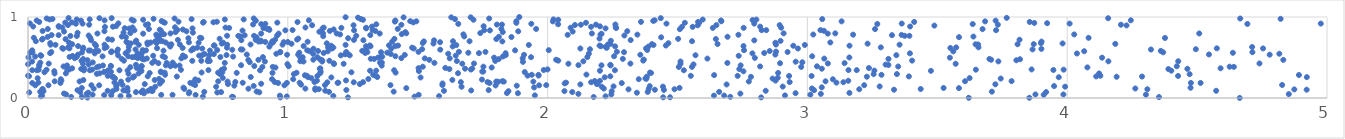
| Category | Series 0 |
|---|---|
| 3.6572658706064907 | 0.661 |
| 0.12488495006615727 | 0.186 |
| 5.305837688356848 | 0.75 |
| 4.641559317496017 | 0.384 |
| 0.016328903173061366 | 0.185 |
| 1.1230672763371188 | 0.362 |
| 2.6889829667601166 | 0.167 |
| 1.136332484358513 | 0.763 |
| 3.7351509413881963 | 0.452 |
| 0.7432439911413219 | 0.073 |
| 3.0502850701890116 | 0.838 |
| 5.891432376077439 | 0.377 |
| 1.694871493785665 | 0.559 |
| 2.199783628751933 | 0.734 |
| 0.7177247595777002 | 0.649 |
| 0.4360049572688473 | 0.073 |
| 0.5077936578489315 | 0.178 |
| 4.575916442292629 | 0.613 |
| 0.9712841414920481 | 0.007 |
| 0.3824785432868489 | 0.124 |
| 2.2014640019795064 | 0.212 |
| 3.7245375799674973 | 0.955 |
| 1.9451837285423832 | 0.202 |
| 2.201658809109568 | 0.885 |
| 1.0676309917624813 | 0.116 |
| 2.170408864286476 | 0.797 |
| 1.9948663302840532 | 0.159 |
| 0.8191619935575553 | 0.6 |
| 2.87731302166413 | 0.215 |
| 0.6693710988600182 | 0.527 |
| 0.13528188857759899 | 0.607 |
| 1.5195376897890995 | 0.386 |
| 0.34780277661037123 | 0.921 |
| 0.3022666151894579 | 0.628 |
| 4.037467137257961 | 0.55 |
| 0.1511107909865838 | 0.351 |
| 19.713826871288113 | 0.802 |
| 2.1187211437940414 | 0.405 |
| 3.199599758190691 | 0.108 |
| 0.6556808207226618 | 0.217 |
| 0.08563399323390293 | 0.678 |
| 5.979083235172496 | 0.867 |
| 2.394298118082215 | 0.314 |
| 0.04329534751722965 | 0.393 |
| 1.2040109968016028 | 0.527 |
| 1.843560081333627 | 0.061 |
| 2.2598612966648948 | 0.637 |
| 3.3954784804568994 | 0.883 |
| 0.21676148546968782 | 0.363 |
| 0.7681378466997406 | 0.203 |
| 0.897345921890046 | 0.699 |
| 6.013296331971207 | 0.216 |
| 1.1519363624004133 | 0.193 |
| 1.8493596561021688 | 0.085 |
| 0.27392614190585735 | 0.157 |
| 2.963587571943946 | 0.611 |
| 0.598414545187248 | 0.128 |
| 0.01709591938509628 | 0.562 |
| 0.04698012082321113 | 0.077 |
| 1.3193985932964274 | 0.484 |
| 0.934819934063425 | 0.667 |
| 1.544779772904844 | 0.471 |
| 4.816527514047724 | 0.546 |
| 1.7997471160500158 | 0.155 |
| 5.51819471532723 | 0.424 |
| 0.04116393437493838 | 0.349 |
| 1.132338345856245 | 0.451 |
| 1.0763205903068263 | 0.694 |
| 5.975241014381672 | 0.348 |
| 2.040529270171328 | 0.91 |
| 0.9973061045659336 | 0.534 |
| 0.008048993572136683 | 0.561 |
| 0.4404632410741771 | 0.481 |
| 2.866065341260575 | 0.24 |
| 0.2074330044115551 | 0.014 |
| 0.9290228920530227 | 0.634 |
| 0.4142781996018448 | 0.691 |
| 0.14337350675426855 | 0.931 |
| 3.647244868787 | 0.663 |
| 1.4560316584508104 | 0.799 |
| 2.1477250295039294 | 0.929 |
| 0.31985534916476954 | 0.566 |
| 0.0538037949354863 | 0.098 |
| 3.3445056514703095 | 0.296 |
| 0.996501891847038 | 0.186 |
| 1.0358331306130468 | 0.721 |
| 0.41157433685007827 | 0.507 |
| 2.6409552612627962 | 0.283 |
| 0.634714047385056 | 0.174 |
| 7.459160357036828 | 0.591 |
| 1.2447681225433125 | 0.317 |
| 0.29324555355153226 | 0.036 |
| 1.0572380195084625 | 0.504 |
| 0.003911363912921102 | 0.27 |
| 2.7379404052520386 | 0.357 |
| 0.6970017349472133 | 0.526 |
| 0.8710449589008822 | 0.395 |
| 3.855775914844659 | 0.939 |
| 0.16888162406346854 | 0.933 |
| 1.1441971103258843 | 0.09 |
| 3.726191859375836 | 0.837 |
| 0.1368109731713912 | 0.389 |
| 1.7751314844101873 | 0.981 |
| 0.03405276773113676 | 0.343 |
| 1.0142567008799828 | 0.67 |
| 2.1260314594049996 | 0.168 |
| 3.0370177167834367 | 0.391 |
| 0.5237092959568563 | 0.788 |
| 2.742001696406909 | 0.054 |
| 0.23841049227318112 | 0.343 |
| 0.25281846249545636 | 0.115 |
| 0.28699921544127677 | 0.514 |
| 3.5241903376812123 | 0.124 |
| 3.624321500921202 | 0.246 |
| 2.4649259835545556 | 0.677 |
| 1.9228929803768624 | 0.276 |
| 5.687120088991513 | 0.275 |
| 9.10378918165163 | 0.73 |
| 0.749723624523458 | 0.248 |
| 0.9798089048122839 | 0.659 |
| 5.96305607896453 | 0.243 |
| 2.2665881704226982 | 0.571 |
| 0.07996523489264055 | 0.425 |
| 2.2230138888239206 | 0.859 |
| 0.24407906333506052 | 0.158 |
| 1.2538980898227912 | 0.194 |
| 3.1620825113411635 | 0.646 |
| 0.07611435932792937 | 0.852 |
| 0.04323611643794419 | 0.409 |
| 1.704565283657152 | 0.351 |
| 5.3413033552539035 | 0.276 |
| 1.450273264688936 | 0.532 |
| 4.308544645458117 | 0.108 |
| 2.8947501795117825 | 0.429 |
| 2.8967109116318954 | 0.705 |
| 1.7059051133903989 | 0.093 |
| 1.3100868431726298 | 0.235 |
| 2.158747964611163 | 0.547 |
| 1.9390213935937741 | 0.286 |
| 2.318728156968597 | 0.425 |
| 2.3854356107078316 | 0.075 |
| 0.1446168229536243 | 0.727 |
| 0.20489666832608042 | 0.359 |
| 3.1572925125925044 | 0.213 |
| 0.326412456923385 | 0.085 |
| 1.9362093375599272 | 0.503 |
| 0.41642204547915457 | 0.709 |
| 1.1246083667831481 | 0.476 |
| 1.7984190879025688 | 0.458 |
| 0.18791080333996288 | 0.765 |
| 3.390539360444874 | 0.267 |
| 1.985237484173842 | 0.346 |
| 1.1164574343756883 | 0.581 |
| 0.24008588331761033 | 0.586 |
| 0.015880020758756677 | 0.45 |
| 0.10227470504329522 | 0.303 |
| 4.590344274909963 | 0.367 |
| 1.3371665001823427 | 0.827 |
| 0.48962874651928023 | 0.138 |
| 2.0771940453352773 | 0.779 |
| 2.20741523518876 | 0.404 |
| 0.46089144817092875 | 0.269 |
| 2.3113832788262823 | 0.107 |
| 0.2115862414245469 | 0.608 |
| 3.7859165728816095 | 0.208 |
| 2.2413051002884226 | 0.268 |
| 1.6360491299404136 | 0.701 |
| 1.318408826099716 | 0.638 |
| 0.5109315562778457 | 0.325 |
| 1.6716150434163148 | 0.424 |
| 1.8257715845013909 | 0.698 |
| 0.5123360225991334 | 0.318 |
| 1.1698581278180928 | 0.611 |
| 0.37838222935268817 | 0.092 |
| 1.2061366924332129 | 0.866 |
| 2.2197884060904762 | 0.256 |
| 3.583340335821098 | 0.122 |
| 4.874221900602746 | 0.106 |
| 0.5484531121508318 | 0.797 |
| 0.7478820321444526 | 0.316 |
| 1.0002951579853085 | 0.691 |
| 2.2637852078258858 | 0.863 |
| 7.484753117693394 | 0.475 |
| 4.24485629311146 | 0.959 |
| 1.1540451129421998 | 0.577 |
| 1.3007781258458542 | 0.639 |
| 1.8383366832489172 | 0.553 |
| 1.4093306193410033 | 0.343 |
| 8.834869042249903 | 0.205 |
| 1.8023230566815398 | 0.203 |
| 1.6552042546350665 | 0.306 |
| 0.6994692365747046 | 0.456 |
| 1.699564696704696 | 0.701 |
| 0.2593628345680839 | 0.58 |
| 1.6586903435621068 | 0.57 |
| 2.1892897500965782 | 0.175 |
| 3.016168182065957 | 0.271 |
| 2.0648662801384834 | 0.085 |
| 1.2247130168417522 | 0.568 |
| 1.9653390136020064 | 0.277 |
| 0.16619963546744254 | 0.013 |
| 0.941028120334346 | 0.31 |
| 0.5887272784408832 | 0.348 |
| 1.7777789901737795 | 0.835 |
| 2.4065918340592996 | 0.952 |
| 4.712905403056651 | 0.565 |
| 2.7030642187105136 | 0.014 |
| 0.4022885292404415 | 0.871 |
| 3.621010425874077 | 0.003 |
| 1.0234992284618079 | 0.295 |
| 2.517089263345871 | 0.878 |
| 3.4887514881380004 | 0.894 |
| 7.38437663269143 | 0.954 |
| 2.177368376322049 | 0.012 |
| 0.15754547015857084 | 0.685 |
| 2.382258633060556 | 0.264 |
| 5.111035273042533 | 0.186 |
| 3.057132698206381 | 0.974 |
| 2.7882913034767367 | 0.551 |
| 2.471505294997942 | 0.009 |
| 1.4231544294976664 | 0.853 |
| 0.5832647752675778 | 0.4 |
| 1.6435756813526847 | 0.974 |
| 0.8776763827473373 | 0.738 |
| 1.3175530496773338 | 0.777 |
| 0.053862407323460475 | 0.721 |
| 1.3015326760039185 | 0.867 |
| 1.1882272284687423 | 0.796 |
| 5.407444704901816 | 0.435 |
| 8.36790380814906 | 0.866 |
| 3.55028630973469 | 0.618 |
| 0.0004735695306663168 | 0.275 |
| 0.4796169601096651 | 0.089 |
| 2.3979806533466026 | 0.309 |
| 2.8181735464074067 | 0.881 |
| 1.8608869940167534 | 0.753 |
| 0.08687996721296803 | 0.658 |
| 0.6944467894887103 | 0.479 |
| 1.5867787742963628 | 0.597 |
| 0.15954333496815 | 0.613 |
| 4.122841754037557 | 0.303 |
| 4.831832467227187 | 0.471 |
| 0.8535575141876922 | 0.442 |
| 0.4605202783097196 | 0.662 |
| 0.3405197279610687 | 0.112 |
| 1.656173618586531 | 0.915 |
| 0.3867685587077209 | 0.299 |
| 0.9694873911283568 | 0.029 |
| 2.356915241524508 | 0.534 |
| 0.7852443190133125 | 0.014 |
| 0.5962538665534964 | 0.845 |
| 3.2825458390050652 | 0.625 |
| 0.18770555300201347 | 0.508 |
| 2.2538251864035828 | 0.143 |
| 0.51190923874959 | 0.829 |
| 0.118498932582102 | 0.879 |
| 0.17182000761298416 | 0.519 |
| 1.8857919528792364 | 0.059 |
| 0.20091316630416411 | 0.072 |
| 1.1121336471706837 | 0.214 |
| 0.2757360710344821 | 0.304 |
| 1.2148642324067536 | 0.422 |
| 1.3443734019371725 | 0.259 |
| 3.898923914208882 | 0.677 |
| 0.6672609124131331 | 0.739 |
| 5.956493366089798 | 0.335 |
| 4.693451552981267 | 0.914 |
| 0.05081281222401013 | 0.521 |
| 1.1943550193319816 | 0.189 |
| 0.6017575632879553 | 0.112 |
| 2.635929592020172 | 0.865 |
| 2.5616420845588657 | 0.414 |
| 1.3549117083108686 | 0.436 |
| 3.986235770537355 | 0.35 |
| 0.2060314472379652 | 0.458 |
| 10.31824751857852 | 0.852 |
| 1.7098841289265538 | 0.364 |
| 0.49369308793589406 | 0.781 |
| 5.669549067581493 | 0.986 |
| 4.426776216230428 | 0.272 |
| 0.6209823151953527 | 0.071 |
| 1.752348451570769 | 0.327 |
| 0.2071432009293176 | 0.124 |
| 0.30874417885118616 | 0.725 |
| 9.092827902446187 | 0.908 |
| 1.3153903593284209 | 0.649 |
| 2.5557748340125235 | 0.384 |
| 1.098908765739014 | 0.609 |
| 0.4494804308173819 | 0.172 |
| 1.9373488450836887 | 0.916 |
| 1.6293222107819736 | 0.996 |
| 0.8801060534009901 | 0.748 |
| 2.4355026057825944 | 0.986 |
| 0.398955751160589 | 0.967 |
| 1.560609557395247 | 0.673 |
| 0.9628184683578631 | 0.185 |
| 2.8858221507320154 | 0.249 |
| 0.7666822486174345 | 0.657 |
| 2.3930410547894607 | 0.147 |
| 0.5198514401351664 | 0.939 |
| 4.5457908324637355 | 0.538 |
| 0.4432627613463488 | 0.966 |
| 0.08969663377651806 | 0.568 |
| 0.8480944456128245 | 0.469 |
| 0.05967912167219596 | 0.084 |
| 0.3072535856171781 | 0.34 |
| 1.0781896072318118 | 0.257 |
| 0.5271361640963339 | 0.503 |
| 0.39550619100631895 | 0.674 |
| 0.713657947650901 | 0.935 |
| 0.45951787873604344 | 0.684 |
| 0.6729042743764846 | 0.016 |
| 2.25908993591751 | 0.343 |
| 0.7661805715309865 | 0.768 |
| 0.6436693619621839 | 0.229 |
| 0.8168733600097449 | 0.76 |
| 0.1545145019196297 | 0.624 |
| 3.1759546082929626 | 0.782 |
| 0.5476992090965954 | 0.635 |
| 2.2895825603855746 | 0.483 |
| 0.21495822280392662 | 0.34 |
| 2.5091191616605535 | 0.85 |
| 2.6403866438740797 | 0.029 |
| 2.8338152752529577 | 0.555 |
| 2.0656644738968577 | 0.18 |
| 3.5727598205951043 | 0.624 |
| 3.985419098167845 | 0.044 |
| 0.1874893764436643 | 0.97 |
| 2.8549696111737304 | 0.58 |
| 5.582486102609008 | 0.821 |
| 3.055652911545339 | 0.362 |
| 2.887281529583459 | 0.309 |
| 0.4624625532021408 | 0.089 |
| 3.161491187434072 | 0.5 |
| 4.740142416947577 | 0.426 |
| 3.257749285732577 | 0.338 |
| 1.5950690547963449 | 0.159 |
| 0.7980263941058955 | 0.198 |
| 0.6324591302473828 | 0.458 |
| 0.08516762065564383 | 0.554 |
| 1.4244992051141685 | 0.647 |
| 0.2650923158131358 | 0.379 |
| 4.821419174379522 | 0.978 |
| 0.3896381135009718 | 0.858 |
| 2.0202081495225075 | 0.946 |
| 4.3533563455344835 | 0.011 |
| 2.443988721316575 | 0.14 |
| 1.828251476174368 | 0.513 |
| 4.5733436881384195 | 0.089 |
| 0.09091087823421723 | 0.777 |
| 3.3009994922308215 | 0.413 |
| 2.447691817516153 | 0.1 |
| 0.016196257893473863 | 0.588 |
| 3.47541891699439 | 0.335 |
| 1.060511468171022 | 0.451 |
| 1.2634051559532422 | 0.768 |
| 0.6347670892564682 | 0.807 |
| 2.227714575237633 | 0.62 |
| 2.692565900424227 | 0.756 |
| 2.407712318024307 | 0.655 |
| 4.322457837269195 | 0.599 |
| 0.20401637724634883 | 0.955 |
| 0.4068750280784092 | 0.955 |
| 4.082305115696589 | 0.743 |
| 2.167693068298063 | 0.195 |
| 2.4552618379375346 | 0.648 |
| 4.637710018494741 | 0.558 |
| 0.19852478520637404 | 0.204 |
| 1.8869838525477636 | 0.823 |
| 3.2690730073949448 | 0.914 |
| 0.913506587524087 | 0.692 |
| 1.5170675516697318 | 0.603 |
| 1.7940597288174625 | 0.498 |
| 0.3520448860973335 | 0.342 |
| 6.71605705372137 | 0.654 |
| 2.457508111277598 | 0.918 |
| 2.7356050836539985 | 0.521 |
| 3.1073192767398266 | 0.798 |
| 2.1184700533398515 | 0.051 |
| 0.4946670490232352 | 0.678 |
| 2.0710813709217937 | 0.19 |
| 1.093599786150519 | 0.899 |
| 0.5845518973296717 | 0.66 |
| 1.909362751198064 | 0.533 |
| 2.7977058141576907 | 0.495 |
| 1.3025203214545427 | 0.605 |
| 4.976156562541755 | 0.919 |
| 2.6676092687974826 | 0.957 |
| 1.9050729021284787 | 0.446 |
| 0.34252750024188927 | 0.571 |
| 0.9062628775882867 | 0.863 |
| 1.7485522822169797 | 0.327 |
| 0.2131419213201437 | 0.221 |
| 4.127630382687632 | 0.275 |
| 0.15623986059543252 | 0.987 |
| 5.14926126685312 | 0.37 |
| 0.2331260336843538 | 0.413 |
| 3.011355169124624 | 0.041 |
| 6.904757796338855 | 0.905 |
| 0.10578354478773558 | 0.656 |
| 0.5770055135149057 | 0.717 |
| 2.18619768911902 | 0.905 |
| 0.4011008315008461 | 0.504 |
| 7.189522104679802 | 0.219 |
| 3.411031277150165 | 0.939 |
| 1.6759404929458854 | 0.786 |
| 1.595635366578127 | 0.18 |
| 2.3881734020301297 | 0.635 |
| 2.2050185330405245 | 0.639 |
| 2.9899849423137814 | 0.655 |
| 2.3066192448412655 | 0.825 |
| 1.1057032084484166 | 0.119 |
| 0.23352246316437245 | 0.771 |
| 0.8874772131061719 | 0.697 |
| 0.14691706105682603 | 0.045 |
| 0.8701436826259812 | 0.767 |
| 2.0886264498170166 | 0.868 |
| 7.708364549669626 | 0.298 |
| 3.051763917971592 | 0.051 |
| 2.5115748157142774 | 0.422 |
| 5.163846975870921 | 0.162 |
| 5.375932499903694 | 0.582 |
| 0.05695962641754336 | 0.731 |
| 0.36062882814133657 | 0.483 |
| 3.285123140266262 | 0.286 |
| 3.6389821688630644 | 0.759 |
| 8.40320109770549 | 0.806 |
| 0.09426934754585325 | 0.976 |
| 8.585694580883034 | 0.61 |
| 0.3768496423713827 | 0.751 |
| 2.5051517141083943 | 0.383 |
| 0.7321621842734815 | 0.206 |
| 8.799191146673632 | 0.168 |
| 5.751660565809943 | 0.792 |
| 2.2854487300785484 | 0.184 |
| 1.0678589538555623 | 0.87 |
| 3.9468749235398772 | 0.346 |
| 3.922769523622227 | 0.924 |
| 1.2980366523473665 | 0.556 |
| 1.7039802680595872 | 0.996 |
| 3.392600869856881 | 0.768 |
| 0.8302249388067582 | 0.97 |
| 2.615057849228092 | 0.486 |
| 0.34681359968811404 | 0.527 |
| 5.76627291410505 | 0.222 |
| 0.8974329683252511 | 0.176 |
| 0.21003840847387995 | 0.918 |
| 0.6043043966057309 | 0.509 |
| 1.1354313111598557 | 0.799 |
| 0.1699347566725617 | 0.367 |
| 1.622122449372031 | 0.357 |
| 2.77448406824726 | 0.204 |
| 2.1376976341401703 | 0.453 |
| 1.3016193995359697 | 0.86 |
| 2.9050141427959533 | 0.141 |
| 1.1055312595423805 | 0.102 |
| 1.6505905255360354 | 0.456 |
| 1.1550209112158383 | 0.626 |
| 0.7270907592951766 | 0.941 |
| 0.36919593641016973 | 0.46 |
| 0.8903523567206577 | 0.07 |
| 1.6792123900804246 | 0.76 |
| 2.8767137726068097 | 0.681 |
| 0.2290059505381542 | 0.467 |
| 0.07135446646143953 | 0.349 |
| 2.2420842169418025 | 0.668 |
| 4.077701065580592 | 0.378 |
| 0.438851497320443 | 0.557 |
| 4.753893673025617 | 0.612 |
| 3.0175384865231023 | 0.118 |
| 2.5583956048424503 | 0.878 |
| 0.6764778460676041 | 0.938 |
| 1.3262060433461216 | 0.838 |
| 0.32447688942664893 | 0.262 |
| 3.0697140755250145 | 0.206 |
| 6.177295548623936 | 0.956 |
| 2.597043801973548 | 0.968 |
| 1.7847877079189591 | 0.377 |
| 1.2384181158006928 | 0.527 |
| 5.207874169686829 | 0.773 |
| 5.097012474339593 | 0.993 |
| 0.48769499269717415 | 0.222 |
| 0.6368216768582246 | 0.603 |
| 2.3508539793193273 | 0.232 |
| 5.18884567245709 | 0.663 |
| 1.64854942958686 | 0.653 |
| 2.8415877768167497 | 0.838 |
| 0.16318641419585497 | 0.766 |
| 0.5018784410948749 | 0.43 |
| 4.922347808477579 | 0.258 |
| 2.7561124593420123 | 0.591 |
| 0.8095703244667993 | 0.766 |
| 2.5826163548461016 | 0.926 |
| 0.23360991914202958 | 0.586 |
| 2.262131421697066 | 0.874 |
| 1.3324558370131618 | 0.482 |
| 6.421418506341996 | 0.792 |
| 0.3458250551518705 | 0.599 |
| 0.6410023526970536 | 0.202 |
| 0.5070655456751068 | 0.844 |
| 0.38630076480016673 | 0.585 |
| 3.2186259323821695 | 0.158 |
| 3.7331648717914674 | 0.905 |
| 0.6708352216978104 | 0.61 |
| 1.2253490750084894 | 0.099 |
| 1.9508988264193845 | 0.032 |
| 0.8265547228214193 | 0.188 |
| 1.511064573477946 | 0.253 |
| 1.6822700699939843 | 0.362 |
| 0.319111393921192 | 0.398 |
| 2.913786361221685 | 0.032 |
| 2.0043783222079297 | 0.591 |
| 1.4521718042186553 | 0.813 |
| 1.9558027467562231 | 0.852 |
| 0.24923347394853199 | 0.439 |
| 1.6462454896110585 | 0.523 |
| 3.278072590309628 | 0.143 |
| 0.1909099586631372 | 0.805 |
| 2.3703488150875875 | 0.474 |
| 0.40972761682487796 | 0.836 |
| 2.5282329269208077 | 0.929 |
| 0.42273421250584675 | 0.492 |
| 0.6619364947550141 | 0.743 |
| 1.3961503631235321 | 0.544 |
| 2.437101100580808 | 0.749 |
| 2.343692598610321 | 0.065 |
| 0.6285249557696834 | 0.588 |
| 1.5046522402798246 | 0.333 |
| 0.38795264401666985 | 0.631 |
| 0.13865192373612328 | 0.055 |
| 0.3676828332315766 | 0.808 |
| 5.148465887441961 | 0.201 |
| 1.668759888127328 | 0.139 |
| 1.0908737138661475 | 0.245 |
| 1.407538378316451 | 0.079 |
| 1.4561083187374606 | 0.122 |
| 2.89898680550804 | 0.868 |
| 0.7895420727452027 | 0.511 |
| 0.3193362267371726 | 0.323 |
| 4.111690865215847 | 0.267 |
| 0.7641856874414632 | 0.53 |
| 2.241397577051325 | 0.409 |
| 3.7071553927482177 | 0.472 |
| 0.6670977362628746 | 0.459 |
| 6.939087758979724 | 0.571 |
| 2.95496314814982 | 0.448 |
| 0.3234168345926125 | 0.72 |
| 3.866700362573191 | 0.6 |
| 3.1118447115454693 | 0.19 |
| 3.2288945935749522 | 0.263 |
| 0.9291854632269494 | 0.841 |
| 5.209456396152935 | 0.716 |
| 3.3494277224041658 | 0.389 |
| 0.4832378161485963 | 0.978 |
| 0.43666101825655035 | 0.333 |
| 1.3952370556762421 | 0.159 |
| 0.04321757868297564 | 0.939 |
| 1.5032679952290395 | 0.369 |
| 0.3065488567497712 | 0.089 |
| 1.1326506241106653 | 0.465 |
| 2.822132100577999 | 0.008 |
| 6.40757166788218 | 0.231 |
| 1.2893471367503768 | 0.965 |
| 0.3561583824230933 | 0.023 |
| 4.625213523371893 | 0.386 |
| 6.147948978953677 | 0.294 |
| 0.8572639132625396 | 0.259 |
| 1.740909549940414 | 0.801 |
| 2.105349454650429 | 0.901 |
| 1.231588896123453 | 0.008 |
| 2.412916418041942 | 0.102 |
| 0.5961023093736197 | 0.525 |
| 0.0002992944555704064 | 0.417 |
| 1.1777675037072575 | 0.42 |
| 1.2773494710291313 | 0.172 |
| 2.319724219320752 | 0.715 |
| 0.7941621136650354 | 0.153 |
| 0.07877688157625426 | 0.157 |
| 0.23555242144945793 | 0.905 |
| 0.489647814200831 | 0.7 |
| 3.0635766962271926 | 0.83 |
| 0.9984994209821714 | 0.418 |
| 5.524609342988502 | 0.183 |
| 2.2955458895775336 | 0.771 |
| 3.333408147958844 | 0.102 |
| 1.0441492613775287 | 0.56 |
| 3.7100634002064186 | 0.079 |
| 1.2223970859439497 | 0.656 |
| 2.5692027269238014 | 0.528 |
| 1.3406602696478922 | 0.91 |
| 1.4948898736591276 | 0.947 |
| 3.4360631322730653 | 0.111 |
| 4.50825053574809 | 0.797 |
| 0.5127762260774804 | 0.039 |
| 3.2549196435305374 | 0.294 |
| 5.2090110584262845 | 0.977 |
| 3.909585646529983 | 0.04 |
| 2.245311301112599 | 0.044 |
| 0.07577064914420184 | 0.754 |
| 3.900739383370301 | 0.606 |
| 2.654116544883827 | 0.666 |
| 1.1916782551728433 | 0.187 |
| 1.1431319353098772 | 0.16 |
| 1.3895878474852021 | 0.65 |
| 5.570645281952213 | 0.227 |
| 0.10275325112081848 | 0.206 |
| 5.366230230882079 | 0.838 |
| 0.6191073646406455 | 0.058 |
| 5.9019928048932675 | 0.516 |
| 4.389426973169759 | 0.357 |
| 0.5751274690554433 | 0.84 |
| 1.3620243469484665 | 0.437 |
| 8.882228547905914 | 0.398 |
| 0.7603431505417247 | 0.87 |
| 0.803387964257158 | 0.31 |
| 0.7576480260551832 | 0.969 |
| 3.862932431655758 | 0.353 |
| 3.325617718402951 | 0.776 |
| 5.693279011420388 | 0.322 |
| 0.2672531185185897 | 0.796 |
| 2.9317442163613836 | 0.197 |
| 0.48186230696080684 | 0.521 |
| 2.818045503939663 | 0.389 |
| 3.5707127267204326 | 0.423 |
| 2.577952982444209 | 0.898 |
| 0.6784931092833711 | 0.076 |
| 1.2864931552264687 | 0.582 |
| 1.0478884397198673 | 0.501 |
| 0.7547992249400158 | 0.362 |
| 1.4140699559190766 | 0.957 |
| 2.6476087636657915 | 0.728 |
| 0.2399067561137815 | 0.742 |
| 1.7537472621681376 | 0.886 |
| 6.0863071187298265 | 0.073 |
| 1.4103069491053843 | 0.73 |
| 1.6011668629476354 | 0.088 |
| 1.1025737035712524 | 0.198 |
| 1.0033104246128703 | 0.392 |
| 0.4360045693973046 | 0.513 |
| 0.2651111383173145 | 0.298 |
| 1.6333956810738635 | 0.223 |
| 0.7241418357772829 | 0.139 |
| 1.6660668778429912 | 0.196 |
| 0.7891373598616785 | 0.013 |
| 1.6232319289567971 | 0.489 |
| 0.1923602820956957 | 0.535 |
| 4.664129966135105 | 0.001 |
| 0.5300786023027949 | 0.685 |
| 0.9394656428578849 | 0.232 |
| 2.0226529487458302 | 0.97 |
| 0.30713213842075443 | 0.274 |
| 4.228362454168687 | 0.896 |
| 0.10127094264088642 | 0.331 |
| 0.4216839281770647 | 0.55 |
| 2.153064877860706 | 0.506 |
| 1.316602023112295 | 0.337 |
| 3.0257026296878666 | 0.096 |
| 1.039957795088255 | 0.535 |
| 1.2811458246100291 | 0.975 |
| 8.18277813839318 | 0.304 |
| 0.13880981873121864 | 0.82 |
| 1.4140623633677833 | 0.516 |
| 2.8395120211189235 | 0.089 |
| 2.201449951480001 | 0.336 |
| 5.40365147144233 | 0.829 |
| 1.176541412293141 | 0.847 |
| 2.3892941483274805 | 0.113 |
| 0.6567141276857463 | 0.682 |
| 2.232330154727553 | 0.661 |
| 2.203259993338007 | 0.782 |
| 8.451662525216149 | 0.68 |
| 1.9647606437552754 | 0.286 |
| 0.6922658554610246 | 0.455 |
| 0.879981826853992 | 0.08 |
| 0.4540184034292582 | 0.588 |
| 1.6174846065539308 | 0.546 |
| 0.5216345346619454 | 0.585 |
| 3.018366840133118 | 0.515 |
| 4.369423084115776 | 0.564 |
| 1.5643483177791597 | 0.433 |
| 0.24863862778444143 | 0.041 |
| 0.526055764289805 | 0.314 |
| 0.049839532445898935 | 0.021 |
| 1.8118557066425838 | 0.48 |
| 6.207834453778395 | 0.198 |
| 1.4150036121980762 | 0.314 |
| 1.5237930968405526 | 0.699 |
| 0.36386905160772015 | 0.163 |
| 0.8976690346603061 | 0.912 |
| 0.7282803914717103 | 0.592 |
| 6.299998095520148 | 0.725 |
| 4.302946241629192 | 0.04 |
| 0.44633345483224957 | 0.058 |
| 0.5144097180030783 | 0.95 |
| 3.804309366349744 | 0.466 |
| 1.4784073509847226 | 0.622 |
| 2.75463225391715 | 0.866 |
| 4.471237304813311 | 0.294 |
| 2.5077780574872115 | 0.125 |
| 2.094812231190623 | 0.074 |
| 0.9422339572724338 | 0.384 |
| 3.6584271102612806 | 0.625 |
| 2.126076086565002 | 0.611 |
| 0.46841115842517744 | 0.309 |
| 1.3574442238240017 | 0.507 |
| 0.2942682367323346 | 0.824 |
| 0.8689082789076424 | 0.982 |
| 1.8313617383624914 | 0.202 |
| 0.2112235979346933 | 0.424 |
| 1.4711139469929584 | 0.948 |
| 0.5341627530294003 | 0.433 |
| 0.40892825560584173 | 0.267 |
| 5.6604062375039 | 0.788 |
| 1.175210051773415 | 0.024 |
| 2.2076524636878148 | 0.794 |
| 0.11814749899742286 | 0.887 |
| 2.876652300758741 | 0.536 |
| 1.3825546138791438 | 0.56 |
| 2.2558416276204727 | 0.516 |
| 2.7430687443532973 | 0.403 |
| 0.6451656921995791 | 0.038 |
| 0.0474251459877413 | 0.437 |
| 3.7671162401683476 | 0.989 |
| 4.853056090482726 | 0.048 |
| 2.3682639511022603 | 0.462 |
| 0.3580240805511828 | 0.202 |
| 0.28855944434357556 | 0.401 |
| 2.3801190290007237 | 0.237 |
| 1.752970944457016 | 0.387 |
| 0.6194026474462982 | 0.688 |
| 0.9117532438155257 | 0.45 |
| 4.665960555540251 | 0.981 |
| 0.5518848522944294 | 0.663 |
| 0.4431305579984002 | 0.794 |
| 0.6738151719996982 | 0.93 |
| 0.001925892435846932 | 0.501 |
| 1.1138453978742529 | 0.504 |
| 1.5272147207256117 | 0.489 |
| 3.3424002304425824 | 0.529 |
| 3.3626349780595044 | 0.779 |
| 1.1500168925008003 | 0.675 |
| 2.6919362438525596 | 0.433 |
| 0.8664090012962368 | 0.908 |
| 0.8421758026869075 | 0.536 |
| 0.3220540270916691 | 0.576 |
| 3.1384233397654127 | 0.195 |
| 4.779370672113402 | 0.535 |
| 0.5440195582509081 | 0.657 |
| 3.854421817114889 | 0.003 |
| 0.7286709331264797 | 0.068 |
| 1.8812896745648982 | 0.152 |
| 2.1494780297351914 | 0.289 |
| 1.0811183576572168 | 0.959 |
| 0.20760751159173074 | 0.562 |
| 1.0479515396757233 | 0.454 |
| 4.134204929871835 | 0.498 |
| 2.7344407761432423 | 0.78 |
| 0.4368089033651433 | 0.388 |
| 2.929495897102571 | 0.272 |
| 0.5665439820218947 | 0.399 |
| 0.8339886815688994 | 0.774 |
| 4.027013994746401 | 0.785 |
| 0.8763889347947463 | 0.718 |
| 1.8910610103036722 | 1 |
| 1.074688386736366 | 0.589 |
| 0.03709867018774776 | 0.244 |
| 1.0511650119005844 | 0.165 |
| 1.045567243833304 | 0.188 |
| 5.403915780425713 | 0.874 |
| 2.551236640606654 | 0.274 |
| 0.5677333889927638 | 0.813 |
| 1.8261854182446653 | 0.208 |
| 2.3455086520928403 | 0.782 |
| 2.444919853710864 | 0.009 |
| 8.228405156264326 | 0.68 |
| 5.438842716897398 | 0.948 |
| 1.6345500365355918 | 0.636 |
| 1.1383061262251484 | 0.869 |
| 5.666628536483314 | 0.909 |
| 1.2530229541602258 | 0.898 |
| 0.8211629588496531 | 0.714 |
| 2.2000014217653434 | 0.647 |
| 2.080078084885765 | 0.423 |
| 1.0657270732089505 | 0.281 |
| 0.4622881072246368 | 0.91 |
| 1.0207761703745106 | 0.232 |
| 3.991993187972897 | 0.14 |
| 0.4978166974793591 | 0.758 |
| 3.7005993874327103 | 0.482 |
| 5.989561991186676 | 0.573 |
| 0.4655157812855505 | 0.851 |
| 6.992114640042718 | 0.983 |
| 0.3188271062835567 | 0.391 |
| 2.2230030985515925 | 0.633 |
| 3.5484341137801714 | 0.498 |
| 2.893240854545802 | 0.9 |
| 0.21231041011829788 | 0.481 |
| 2.2163413177979137 | 0.117 |
| 10.189207472430308 | 0.601 |
| 4.5134486295674625 | 0.186 |
| 6.288969956160522 | 0.953 |
| 1.2545661760133502 | 0.717 |
| 5.6078156188534125 | 0.905 |
| 1.8098597817588584 | 0.2 |
| 1.0404445274123617 | 0.733 |
| 0.651671593140639 | 0.621 |
| 10.220288018707905 | 0.763 |
| 1.083300200459585 | 0.578 |
| 1.3401792562061097 | 0.337 |
| 0.33491956992112765 | 0.24 |
| 0.7573545852886978 | 0.433 |
| 0.8566685686445319 | 0.661 |
| 3.561509637182533 | 0.575 |
| 2.412244204252167 | 0.959 |
| 1.0982301115677975 | 0.473 |
| 1.2203427619238676 | 0.54 |
| 2.660209305467374 | 0.075 |
| 2.040743586886343 | 0.965 |
| 0.15393613802470382 | 0.901 |
| 1.7608085396148985 | 0.569 |
| 0.6248952242032368 | 0.187 |
| 8.153550776997815 | 0.481 |
| 0.063380087282769 | 0.318 |
| 0.22891054590797216 | 0.006 |
| 3.161827755717523 | 0.063 |
| 1.125215896178738 | 0.365 |
| 1.999960281660311 | 0.353 |
| 3.2317282871479267 | 0.671 |
| 0.1590014491358282 | 0.351 |
| 4.711835376791959 | 0.629 |
| 0.9022731568544158 | 0.383 |
| 0.054284862616984314 | 0.029 |
| 3.0786823450669374 | 0.427 |
| 2.795323378716216 | 0.919 |
| 2.128225020182307 | 0.905 |
| 0.8868573498181188 | 0.471 |
| 1.8242266770575015 | 0.906 |
| 2.0964479992293215 | 0.82 |
| 8.613133476044702 | 0.665 |
| 0.027612693685177957 | 0.511 |
| 0.8257255587773361 | 0.832 |
| 1.9277279420857536 | 0.655 |
| 0.2431399722839495 | 0.713 |
| 0.7742754708737406 | 0.864 |
| 2.5245254335669065 | 0.342 |
| 0.8255560141016134 | 0.598 |
| 0.37896140450228627 | 0.693 |
| 1.5861026465425174 | 0.689 |
| 0.4157026433449367 | 0.41 |
| 1.328852871600304 | 0.286 |
| 0.04805884848022865 | 0.528 |
| 1.363464774816522 | 0.509 |
| 1.5030478749303104 | 0.569 |
| 0.437663060737346 | 0.396 |
| 0.4868952749536647 | 0.455 |
| 2.57924347591018 | 0.939 |
| 2.1673333484966495 | 0.878 |
| 0.15052632589725384 | 0.402 |
| 0.29461846562812355 | 0.958 |
| 1.3061228192593117 | 0.566 |
| 0.9710145953843307 | 0.568 |
| 3.9821709620017276 | 0.673 |
| 0.9133896089864599 | 0.915 |
| 5.604998683131978 | 0.429 |
| 1.4370456899744786 | 0.492 |
| 1.8124342998581113 | 0.755 |
| 1.2321935991814923 | 0.738 |
| 1.1600157030344367 | 0.46 |
| 1.3398361082982426 | 0.271 |
| 1.8748583405477126 | 0.588 |
| 2.242468520291517 | 0.402 |
| 4.376324198539441 | 0.741 |
| 0.5641197737553245 | 0.981 |
| 0.3836277653631698 | 0.088 |
| 2.2465962726587083 | 0.083 |
| 0.5264049664754292 | 0.929 |
| 2.9237192449148965 | 0.567 |
| 0.08333391392220314 | 0.969 |
| 2.208583548910294 | 0.139 |
| 0.18422130561625685 | 0.917 |
| 0.4155931592279491 | 0.073 |
| 9.998389997790088 | 0.779 |
| 0.4782299580810529 | 0.435 |
| 0.4539070377563486 | 0.903 |
| 0.4720089638675651 | 0.685 |
| 5.459309210642542 | 0.753 |
| 0.6588903547172759 | 0.523 |
| 0.33947216017515475 | 0.889 |
| 0.595318036262713 | 0.618 |
| 0.5172976708011398 | 0.701 |
| 0.3937448867589512 | 0.381 |
| 0.030309417580715915 | 0.702 |
| 1.8273642726481247 | 0.814 |
| 4.495106032543261 | 0.602 |
| 3.8711895132994374 | 0.665 |
| 5.967639892347657 | 0.626 |
| 1.033663123906287 | 0.312 |
| 11.104945235417842 | 0.877 |
| 1.8386852454445888 | 0.528 |
| 0.5901321086338777 | 0.489 |
| 1.8221206537143138 | 0.853 |
| 2.2231027542738353 | 0.021 |
| 0.19288306172195147 | 0.641 |
| 2.954412800510053 | 0.059 |
| 2.789079749339368 | 0.963 |
| 2.3764914736899203 | 0.241 |
| 3.8165916019809636 | 0.719 |
| 4.206794935831531 | 0.905 |
| 1.1764498180991079 | 0.428 |
| 3.2368151521607627 | 0.37 |
| 0.7697875875496782 | 0.172 |
| 1.11943497806463 | 0.109 |
| 0.32672084607792135 | 0.88 |
| 2.980486269082461 | 0.441 |
| 2.0410328488204237 | 0.461 |
| 2.191276861310917 | 0.173 |
| 0.027913510598852873 | 0.157 |
| 0.5570630759339319 | 0.437 |
| 5.5503646373746625 | 0.611 |
| 0.32202718883870146 | 0.986 |
| 0.5092764779465448 | 0.705 |
| 1.7764952496449509 | 0.185 |
| 1.223967731711196 | 0.217 |
| 4.89201693772718 | 0.284 |
| 3.583634610513419 | 0.751 |
| 0.42586682538742215 | 0.304 |
| 0.9587267240175945 | 0.771 |
| 1.2909671091224495 | 0.713 |
| 3.6363118947630073 | 0.913 |
| 2.5115988363484854 | 0.451 |
| 2.8035401193858367 | 0.968 |
| 8.201566454541162 | 0.136 |
| 2.163074901144537 | 0.602 |
| 3.1899355043819173 | 0.344 |
| 11.415696486984956 | 0.199 |
| 1.5194535670325495 | 0.679 |
| 3.8089752340642993 | 0.664 |
| 1.4386598564809614 | 0.789 |
| 0.9429524893198943 | 0.687 |
| 0.5278243785072539 | 0.287 |
| 1.255213950337217 | 0.836 |
| 1.175305211541674 | 0.623 |
| 0.32038965459769325 | 0.034 |
| 2.2433940956380996 | 0.707 |
| 0.6100108494583727 | 0.823 |
| 0.38600760257827205 | 0.227 |
| 5.344080168402865 | 0.322 |
| 0.3856967405638186 | 0.515 |
| 1.7167782561881826 | 0.426 |
| 0.2475190335994546 | 0.351 |
| 0.6682161944917637 | 0.315 |
| 7.367074865424898 | 0.325 |
| 0.36730421669375457 | 0.094 |
| 3.72349045211732 | 0.169 |
| 0.9596213362279689 | 0.93 |
| 0.7405315192236568 | 0.505 |
| 4.4008252509366566 | 0.338 |
| 0.7457516546769928 | 0.672 |
| 1.037355619774383 | 0.937 |
| 0.8201612767300284 | 0.405 |
| 0.8768246906993673 | 0.954 |
| 1.1214318689159832 | 0.818 |
| 2.668745132425198 | 0.947 |
| 5.690134254323275 | 0.842 |
| 1.4847925517750673 | 0.611 |
| 2.260958467164369 | 0.907 |
| 2.3595037837042607 | 0.94 |
| 4.427438868188774 | 0.454 |
| 0.39382806332866266 | 0.801 |
| 1.904090859940842 | 0.491 |
| 0.44140012768479714 | 0.591 |
| 0.4334270799207571 | 0.342 |
| 0.6945933472441882 | 0.344 |
| 1.361439996819609 | 0.4 |
| 3.744086693154678 | 0.24 |
| 0.13190807181017566 | 0.616 |
| 2.878978051344141 | 0.66 |
| 4.360375034240946 | 0.581 |
| 0.9843249400559312 | 0.69 |
| 1.1247430855221543 | 0.307 |
| 2.3834514435816123 | 0.593 |
| 1.1339127044706816 | 0.859 |
| 0.955819560659691 | 0.546 |
| 12.496961550332639 | 0.54 |
| 0.17998655145071232 | 0.492 |
| 0.7154145566789786 | 0.542 |
| 0.7317458712242751 | 0.313 |
| 2.5559507387814673 | 0.701 |
| 0.5105925276446313 | 0.78 |
| 1.1138765952782423 | 0.272 |
| 0.07183165679605817 | 0.982 |
| 3.3117455157172095 | 0.408 |
| 0.36095669545751913 | 0.759 |
| 0.8965707803605173 | 0.707 |
| 0.03986275187006793 | 0.19 |
| 0.5728571431413737 | 0.265 |
| 5.078373778608371 | 0.746 |
| 0.9905735129011998 | 0.835 |
| 1.158650100527667 | 0.075 |
| 1.3590470349766919 | 0.565 |
| 0.29524469473520276 | 0.615 |
| 0.17017887732472414 | 0.664 |
| 0.8485025960401825 | 0.115 |
| 0.6330947444150942 | 0.859 |
| 0.530468507606084 | 0.404 |
| 1.48786167189415 | 0.017 |
| 0.44670641374876674 | 0.477 |
| 0.6789367423738034 | 0.543 |
| 3.143044289068499 | 0.431 |
| 3.078414090849574 | 0.795 |
| 2.9457328344425218 | 0.645 |
| 1.8797263226186063 | 0.948 |
| 8.447875237847224 | 0.072 |
| 2.4015811086731835 | 0.665 |
| 0.004757000641454335 | 0.069 |
| 2.4883927048422 | 0.108 |
| 0.9869142564946182 | 0.157 |
| 3.131606827747881 | 0.946 |
| 1.7473441060321493 | 0.228 |
| 0.7153542307928279 | 0.647 |
| 1.347889097911419 | 0.5 |
| 0.1323422449606971 | 0.87 |
| 0.6172399943757388 | 0.738 |
| 2.294188808368864 | 0.566 |
| 0.9403383517719901 | 0.7 |
| 0.45756676305239585 | 0.487 |
| 5.947969935502721 | 0.29 |
| 0.8933518566695507 | 0.342 |
| 0.5161368266613243 | 0.209 |
| 1.097355239968741 | 0.545 |
| 3.1581308682749194 | 0.345 |
| 0.4733256166366246 | 0.112 |
| 0.9699305428466285 | 0.564 |
| 1.4136458115350463 | 0.641 |
| 5.677809900464396 | 0.667 |
| 0.6296766400558103 | 0.973 |
| 0.7377285657968472 | 0.731 |
| 0.9043239795565948 | 0.505 |
| 4.262146980470342 | 0.118 |
| 5.888616158473344 | 0.346 |
| 3.3631272794395977 | 0.919 |
| 0.3839972598800404 | 0.682 |
| 4.462552387944657 | 0.36 |
| 1.5629804774921494 | 0.712 |
| 3.91870510033305 | 0.073 |
| 12.590201840577919 | 0.148 |
| 0.8687394107171132 | 0.149 |
| 1.4371082066595582 | 0.904 |
| 3.3120073073369016 | 0.482 |
| 6.976144847314923 | 0.157 |
| 3.3547518722026317 | 0.658 |
| 1.7561297860204335 | 0.837 |
| 0.5483425162616604 | 0.392 |
| 0.5658288078669915 | 0.873 |
| 0.6355065859288349 | 0.612 |
| 0.12848692965302716 | 0.215 |
| 3.065029910069726 | 0.486 |
| 1.5037449751694172 | 0.04 |
| 4.185143099316282 | 0.668 |
| 0.5793673862867808 | 0.942 |
| 1.167658396943144 | 0.254 |
| 0.5026519103773635 | 0.737 |
| 0.49673128492256674 | 0.615 |
| 2.9084354079750523 | 0.798 |
| 0.29248893350017346 | 0.321 |
| 2.7315040686323164 | 0.273 |
| 6.217726488348481 | 0.206 |
| 1.166888663454554 | 0.645 |
| 4.288009331620026 | 0.265 |
| 3.901263121701564 | 0.696 |
| 1.1265211171074392 | 0.325 |
| 3.0979911481360407 | 0.231 |
| 0.9511900784382034 | 0.721 |
| 0.7394626051843363 | 0.296 |
| 1.606211650574223 | 0.371 |
| 1.0184715938945224 | 0.839 |
| 1.2314590612440097 | 0.544 |
| 0.47685360403607646 | 0.086 |
| 1.3538939400818788 | 0.796 |
| 3.0553509170341218 | 0.132 |
| 1.270270045671709 | 0.992 |
| 0.2374308767859836 | 0.971 |
| 0.7862236922064622 | 0.595 |
| 0.37231978476297334 | 0.862 |
| 1.4830231826033127 | 0.933 |
| 1.7147232640881036 | 0.966 |
| 0.6431893793735586 | 0.159 |
| 0.2566998925221901 | 0.551 |
| 6.941504634609931 | 0.871 |
| 0.4263521141959936 | 0.657 |
| 0.7451413617359588 | 0.348 |
| 5.17057589173054 | 0.774 |
| 0.3881983144663914 | 0.025 |
| 1.4120460131211863 | 0.943 |
| 1.401767612392788 | 0.696 |
| 0.4039617266405089 | 0.253 |
| 1.8026878507152313 | 0.728 |
| 0.33266399095195087 | 0.191 |
| 5.897339509651717 | 0.893 |
| 0.2321157231070966 | 0.066 |
| 1.7732232604057603 | 0.098 |
| 1.9120072688819836 | 0.32 |
| 2.823974052774935 | 0.838 |
| 4.474741358519578 | 0.127 |
| 0.056285247556213745 | 0.827 |
| 3.402978578285285 | 0.462 |
| 1.8797191199164607 | 0.928 |
| 0.3420641544335228 | 0.162 |
| 2.782722754397909 | 0.261 |
| 0.05639414610038824 | 0.113 |
| 0.3285161374191264 | 0.259 |
| 0.016332566601310224 | 0.344 |
| 7.965988142439735 | 0.367 |
| 0.2619704545672472 | 0.644 |
| 0.4208790169713453 | 0.528 |
| 4.009388942119877 | 0.919 |
| 1.9481215381035315 | 0.13 |
| 2.649736605413945 | 0.9 |
| 0.12632359117672304 | 0.232 |
| 3.8183691413226475 | 0.479 |
| 0.21258246406481798 | 0.621 |
| 0.007225458552846902 | 0.921 |
| 1.289642152113643 | 0.196 |
| 0.5043212536751687 | 0.235 |
| 0.3395685312586736 | 0.141 |
| 3.6841244131428903 | 0.946 |
| 1.3981236496877538 | 0.609 |
| 0.38332894037030824 | 0.34 |
| 0.14584340810613283 | 0.304 |
| 0.44180926122148806 | 0.093 |
| 0.022463247106345022 | 0.744 |
| 0.5562728865481605 | 0.039 |
| 0.2944864176232691 | 0.658 |
| 3.374825240937335 | 0.768 |
| 1.0610283107124614 | 0.641 |
| 4.157659947409012 | 0.985 |
| 3.6742032796068766 | 0.85 |
| 0.765726571624939 | 0.621 |
| 1.7358363440617317 | 0.554 |
| 0.27494936356971794 | 0.985 |
| 0.11780202710047401 | 0.776 |
| 1.445761668778969 | 0.995 |
| 2.50239975919557 | 0.73 |
| 3.8776863711094136 | 0.044 |
| 3.3945080966709393 | 0.551 |
| 0.9275094382715844 | 0.852 |
| 2.976020539195766 | 0.384 |
| 0.9961356794878928 | 0.019 |
| 2.679611782374412 | 0.03 |
| 8.99960222029269 | 0.466 |
| 3.0882262976096166 | 0.685 |
| 7.415383547371833 | 0.886 |
| 10.705981977598576 | 0.019 |
| 2.879303163528343 | 0.572 |
| 7.131975122340353 | 0.223 |
| 3.6067331011472628 | 0.207 |
| 0.2706947970173468 | 0.581 |
| 4.827279513686329 | 0.161 |
| 0.02003716838818828 | 0.883 |
| 9.21332639501547 | 0.356 |
| 0.27411074238367494 | 0.39 |
| 0.3756746521057714 | 0.552 |
| 2.3787820807036364 | 0.612 |
| 4.42181704301806 | 0.392 |
| 0.4137809111533148 | 0.6 |
| 0.9646871962153283 | 0.795 |
| 0.03336987060807025 | 0.957 |
| 0.22583798911545963 | 0.051 |
| 3.260375715286517 | 0.851 |
| 1.2012464678344095 | 0.785 |
| 0.41827041042554813 | 0.372 |
| 3.6483337920888648 | 0.35 |
| 1.967428878524443 | 0.157 |
| 0.9206705859490011 | 0.852 |
| 3.967582132649361 | 0.257 |
| 0.952606031716337 | 0.376 |
| 1.0735520388928232 | 0.274 |
| 1.1617176096647264 | 0.828 |
| 0.7509230266205785 | 0.684 |
| 4.0654622450196545 | 0.578 |
| 1.2224090662972849 | 0.997 |
| 3.9494708389015347 | 0.147 |
| 0.7000546518997472 | 0.586 |
| 6.889933610265858 | 0.383 |
| 0.1904164925535068 | 0.097 |
| 0.8975008649473222 | 0.796 |
| 0.5183320822408714 | 0.515 |
| 2.7955202804399235 | 0.711 |
| 0.2962276522889234 | 0.877 |
| 2.753806648548102 | 0.33 |
| 2.181713798010932 | 0.21 |
| 3.0225291515583037 | 0.784 |
| 1.1381054060031957 | 0.556 |
| 0.9495690914380894 | 0.198 |
| 1.3239849235293029 | 0.882 |
| 0.16007204488143242 | 0.507 |
| 4.476138258925051 | 0.186 |
| 4.921735064484127 | 0.102 |
| 1.7687864808077924 | 0.197 |
| 1.5823886867841541 | 0.023 |
| 0.2570713242214559 | 0.666 |
| 4.190223077496064 | 0.262 |
| 4.158583682465383 | 0.453 |
| 2.0327365775886896 | 0.472 |
| 2.754018062856115 | 0.641 |
| 1.805044869937502 | 0.907 |
| 3.873298761638779 | 0.927 |